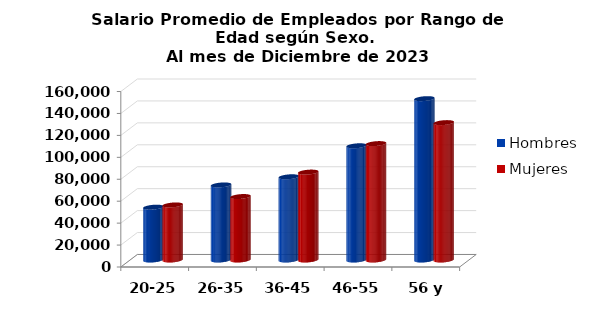
| Category | Hombres | Mujeres |
|---|---|---|
| 20-25 | 48166.667 | 50200 |
| 26-35 | 68441.681 | 57843.6 |
| 36-45 | 75876.622 | 80140.987 |
| 46-55 | 104144.31 | 106121.88 |
| 56 y más | 147123.926 | 125258.238 |